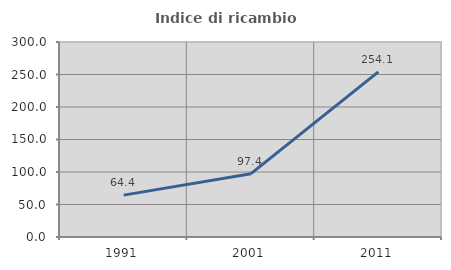
| Category | Indice di ricambio occupazionale  |
|---|---|
| 1991.0 | 64.434 |
| 2001.0 | 97.429 |
| 2011.0 | 254.148 |